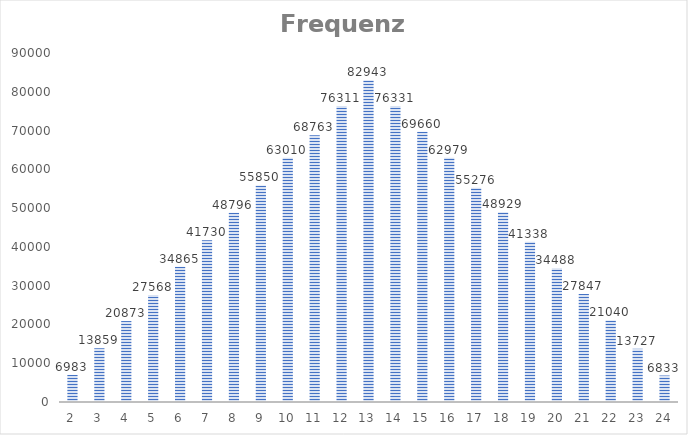
| Category | Series 1 |
|---|---|
| 2.0 | 6983 |
| 3.0 | 13859 |
| 4.0 | 20873 |
| 5.0 | 27568 |
| 6.0 | 34865 |
| 7.0 | 41730 |
| 8.0 | 48796 |
| 9.0 | 55850 |
| 10.0 | 63010 |
| 11.0 | 68763 |
| 12.0 | 76311 |
| 13.0 | 82943 |
| 14.0 | 76331 |
| 15.0 | 69660 |
| 16.0 | 62979 |
| 17.0 | 55276 |
| 18.0 | 48929 |
| 19.0 | 41338 |
| 20.0 | 34488 |
| 21.0 | 27847 |
| 22.0 | 21040 |
| 23.0 | 13727 |
| 24.0 | 6833 |